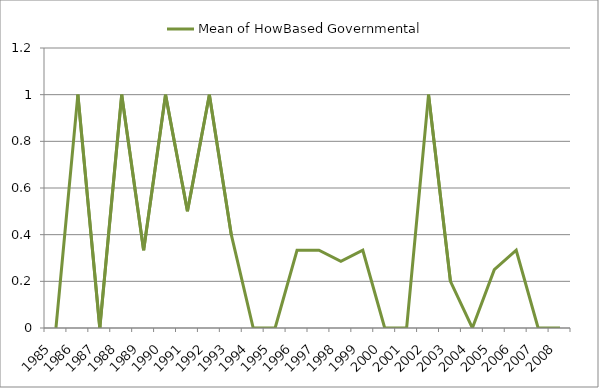
| Category | Mean of HowBased Governmental |
|---|---|
| 1985.0 | 0 |
| 1986.0 | 1 |
| 1987.0 | 0 |
| 1988.0 | 1 |
| 1989.0 | 0.333 |
| 1990.0 | 1 |
| 1991.0 | 0.5 |
| 1992.0 | 1 |
| 1993.0 | 0.4 |
| 1994.0 | 0 |
| 1995.0 | 0 |
| 1996.0 | 0.333 |
| 1997.0 | 0.333 |
| 1998.0 | 0.286 |
| 1999.0 | 0.333 |
| 2000.0 | 0 |
| 2001.0 | 0 |
| 2002.0 | 1 |
| 2003.0 | 0.2 |
| 2004.0 | 0 |
| 2005.0 | 0.25 |
| 2006.0 | 0.333 |
| 2007.0 | 0 |
| 2008.0 | 0 |